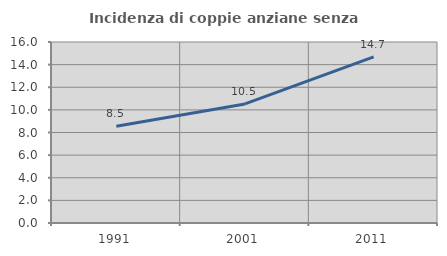
| Category | Incidenza di coppie anziane senza figli  |
|---|---|
| 1991.0 | 8.544 |
| 2001.0 | 10.526 |
| 2011.0 | 14.681 |